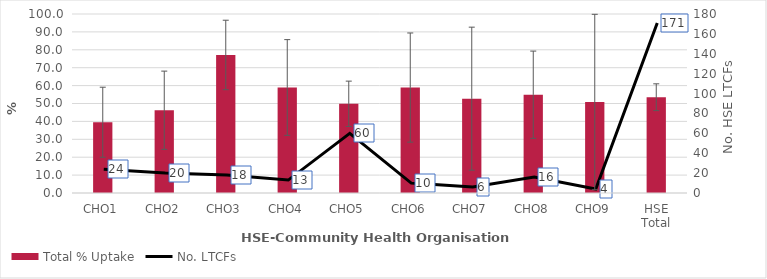
| Category | Total % Uptake |
|---|---|
| CHO1 | 39.537 |
| CHO2 | 46.241 |
| CHO3 | 77.115 |
| CHO4 | 58.951 |
| CHO5 | 49.846 |
| CHO6 | 58.904 |
| CHO7 | 52.7 |
| CHO8 | 54.891 |
| CHO9 | 50.839 |
| HSE Total | 53.514 |